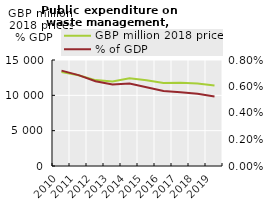
| Category | GBP million 2018 prices |
|---|---|
| 2010.0 | 13309.519 |
| 2011.0 | 12845.901 |
| 2012.0 | 12152.803 |
| 2013.0 | 11943.483 |
| 2014.0 | 12430.444 |
| 2015.0 | 12139.044 |
| 2016.0 | 11755.199 |
| 2017.0 | 11770.975 |
| 2018.0 | 11678 |
| 2019.0 | 11406.853 |